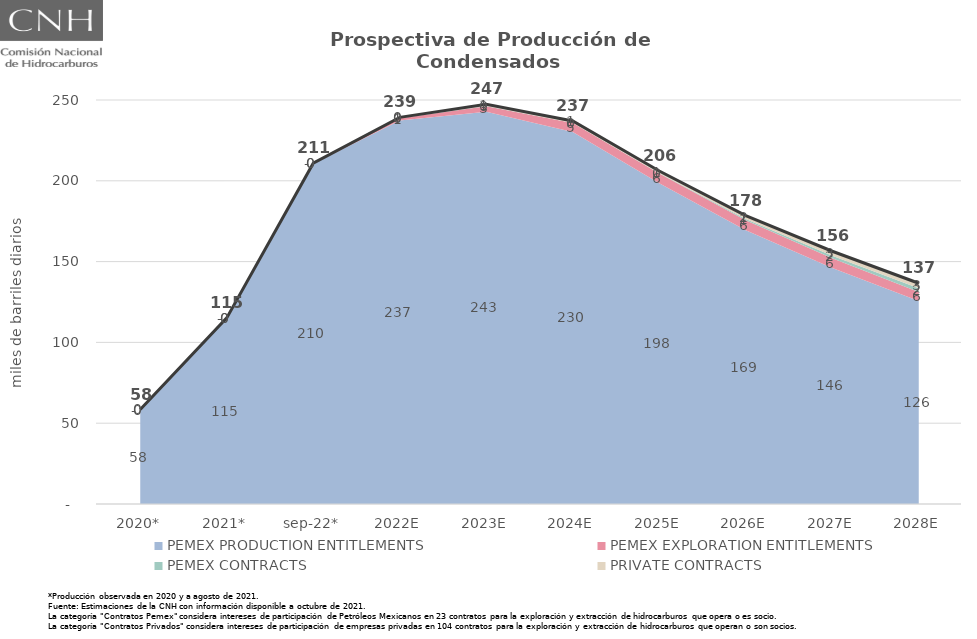
| Category | Total |
|---|---|
| 2020* | 58.421 |
| 2021* | 115.166 |
| sep-22* | 210.883 |
| 2022E | 239.262 |
| 2023E | 247.348 |
| 2024E | 237.025 |
| 2025E | 206.055 |
| 2026E | 178.45 |
| 2027E | 156.399 |
| 2028E | 136.607 |